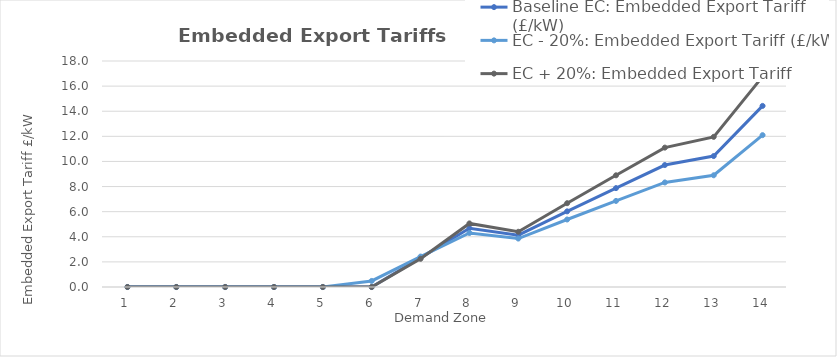
| Category | Baseline EC: Embedded Export Tariff (£/kW) | EC - 20%: Embedded Export Tariff (£/kW) | EC + 20%: Embedded Export Tariff (£/kW) |
|---|---|---|---|
| 0 | 0 | 0 | 0 |
| 1 | 0 | 0 | 0 |
| 2 | 0 | 0 | 0 |
| 3 | 0 | 0 | 0 |
| 4 | 0 | 0 | 0 |
| 5 | 0 | 0.482 | 0 |
| 6 | 2.334 | 2.423 | 2.246 |
| 7 | 4.683 | 4.302 | 5.064 |
| 8 | 4.128 | 3.858 | 4.398 |
| 9 | 6.026 | 5.376 | 6.675 |
| 10 | 7.875 | 6.856 | 8.895 |
| 11 | 9.714 | 8.327 | 11.102 |
| 12 | 10.429 | 8.898 | 11.959 |
| 13 | 14.424 | 12.095 | 16.753 |